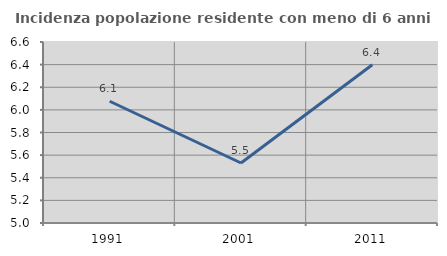
| Category | Incidenza popolazione residente con meno di 6 anni |
|---|---|
| 1991.0 | 6.076 |
| 2001.0 | 5.53 |
| 2011.0 | 6.399 |